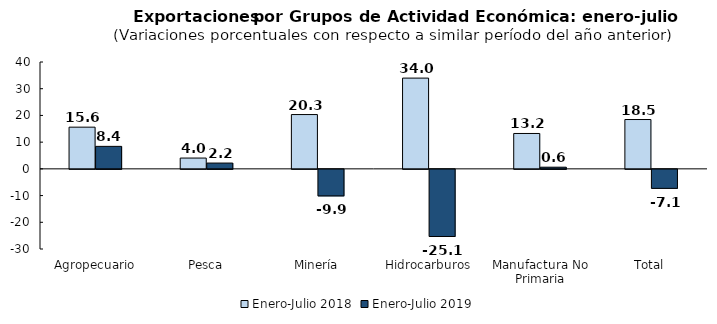
| Category | Enero-Julio 2018 | Enero-Julio 2019 |
|---|---|---|
| Agropecuario | 15.606 | 8.416 |
| Pesca | 4.045 | 2.172 |
| Minería | 20.328 | -9.935 |
| Hidrocarburos | 33.971 | -25.13 |
| Manufactura No Primaria | 13.245 | 0.625 |
| Total | 18.468 | -7.113 |